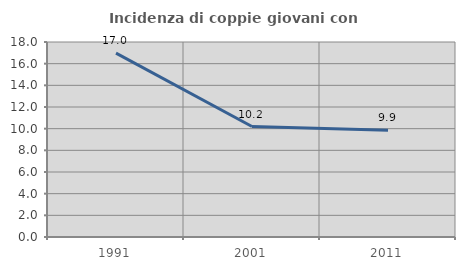
| Category | Incidenza di coppie giovani con figli |
|---|---|
| 1991.0 | 16.978 |
| 2001.0 | 10.197 |
| 2011.0 | 9.854 |